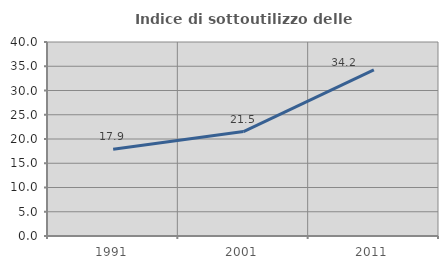
| Category | Indice di sottoutilizzo delle abitazioni  |
|---|---|
| 1991.0 | 17.906 |
| 2001.0 | 21.54 |
| 2011.0 | 34.241 |